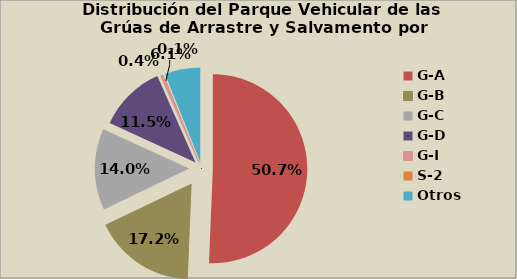
| Category | Series 0 |
|---|---|
| G-A | 50.651 |
| G-B | 17.239 |
| G-C | 13.954 |
| G-D | 11.532 |
| G-I | 0.404 |
| S-2 | 0.128 |
| S-3 | 0.028 |
| Otros | 6.064 |